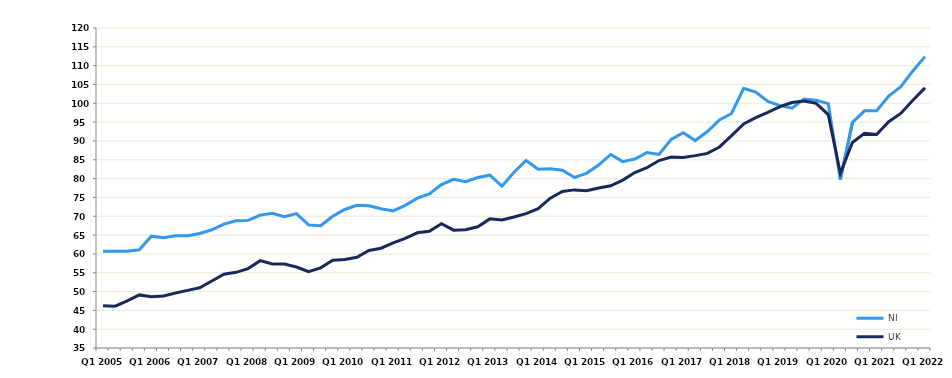
| Category | NI | UK |
|---|---|---|
| Q1 2005 | 60.7 | 46.2 |
|  | 60.7 | 46.1 |
|  | 60.7 | 47.5 |
|  | 61.1 | 49.1 |
| Q1 2006 | 64.7 | 48.6 |
|  | 64.3 | 48.8 |
|  | 64.8 | 49.6 |
|  | 64.8 | 50.3 |
| Q1 2007 | 65.4 | 51 |
|  | 66.4 | 52.8 |
|  | 67.9 | 54.6 |
|  | 68.8 | 55.1 |
| Q1 2008 | 68.9 | 56.1 |
|  | 70.3 | 58.2 |
|  | 70.8 | 57.3 |
|  | 69.9 | 57.3 |
| Q1 2009 | 70.7 | 56.5 |
|  | 67.7 | 55.3 |
|  | 67.5 | 56.3 |
|  | 70 | 58.3 |
| Q1 2010 | 71.8 | 58.5 |
|  | 72.9 | 59.1 |
|  | 72.8 | 60.9 |
|  | 72 | 61.5 |
| Q1 2011 | 71.4 | 62.9 |
|  | 72.9 | 64.1 |
|  | 74.8 | 65.6 |
|  | 75.9 | 66 |
| Q1 2012 | 78.4 | 68 |
|  | 79.8 | 66.3 |
|  | 79.2 | 66.4 |
|  | 80.3 | 67.2 |
| Q1 2013 | 80.9 | 69.3 |
|  | 78 | 69 |
|  | 81.7 | 69.8 |
|  | 84.8 | 70.7 |
| Q1 2014 | 82.5 | 72 |
|  | 82.6 | 74.8 |
|  | 82.2 | 76.6 |
|  | 80.3 | 77 |
| Q1 2015 | 81.4 | 76.8 |
|  | 83.6 | 77.5 |
|  | 86.4 | 78.1 |
|  | 84.5 | 79.6 |
| Q1 2016 | 85.2 | 81.6 |
|  | 86.9 | 82.9 |
|  | 86.4 | 84.8 |
|  | 90.4 | 85.7 |
| Q1 2017 | 92.2 | 85.6 |
|  | 90.1 | 86.1 |
|  | 92.5 | 86.7 |
|  | 95.6 | 88.4 |
| Q1 2018 | 97.3 | 91.4 |
|  | 104 | 94.5 |
|  | 103 | 96.2 |
|  | 100.5 | 97.6 |
| Q1 2019 | 99.4 | 99.1 |
|  | 98.7 | 100.2 |
|  | 101.1 | 100.6 |
|  | 100.8 | 100 |
| Q1 2020 | 99.9 | 97 |
|  | 79.7 | 81.4 |
|  | 94.9 | 89.6 |
|  | 98 | 92 |
| Q1 2021 | 98 | 91.7 |
|  | 101.9 | 95.1 |
|  | 104.4 | 97.3 |
|  | 108.6 | 100.8 |
| Q1 2022 | 112.4 | 104.1 |